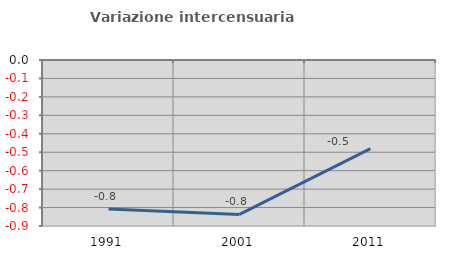
| Category | Variazione intercensuaria annua |
|---|---|
| 1991.0 | -0.807 |
| 2001.0 | -0.837 |
| 2011.0 | -0.481 |